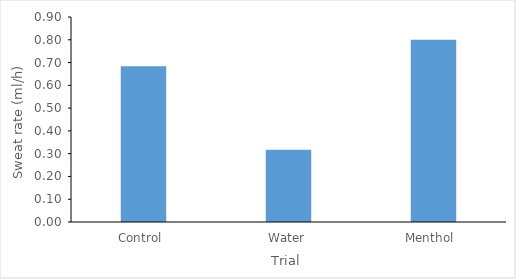
| Category | Series 0 |
|---|---|
| Control  | 0.683 |
| Water | 0.317 |
| Menthol  | 0.8 |